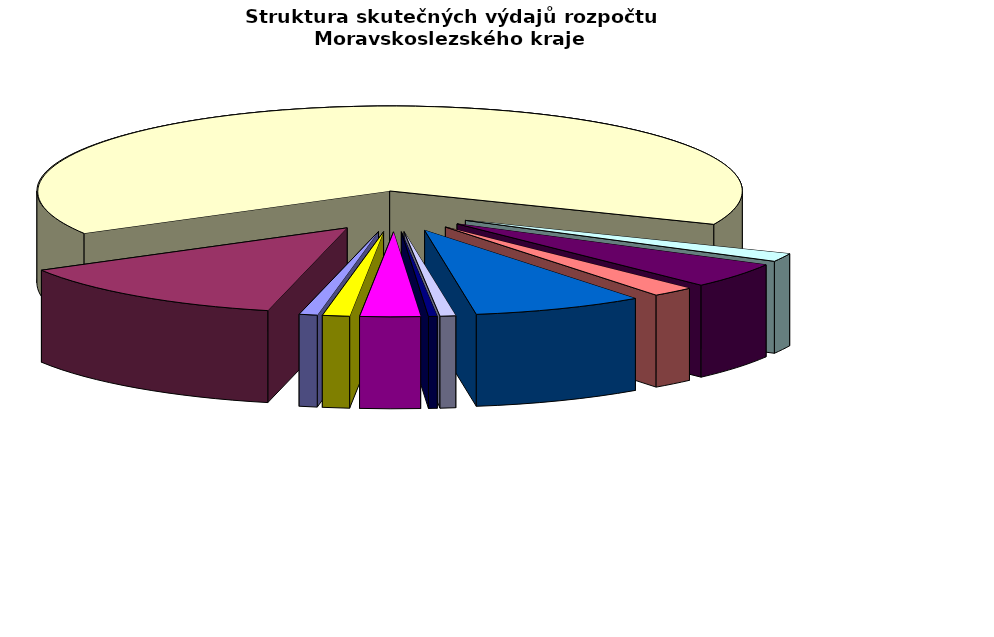
| Category | Series 0 |
|---|---|
| Regionální rozvoj | 150763.94 |
| Doprava | 2365106.68 |
| Školství | 11706822.68 |
| Kultura | 284089.3 |
| Zdravotnictví | 873728.39 |
| Životní prostředí | 356383.01 |
| Sociální věci | 1419728.21 |
| Krizové řízení | 129961.47 |
| Cestovní ruch | 71723.26 |
| Všeobecná veřejná správa a služby | 499079.58 |
| Ostatní | 224927.96 |